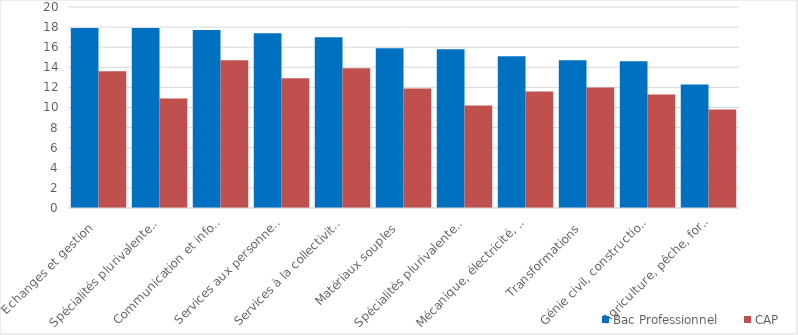
| Category | Bac Professionnel | CAP |
|---|---|---|
| Echanges et gestion | 17.9 | 13.6 |
| Spécialités plurivalentes des services | 17.9 | 10.9 |
| Communication et information | 17.7 | 14.7 |
| Services aux personnes | 17.4 | 12.9 |
| Services à la collectivité | 17 | 13.9 |
| Matériaux souples | 15.9 | 11.9 |
| Spécialités plurivalentes de la production | 15.8 | 10.2 |
| Mécanique, électricité, électronique | 15.1 | 11.6 |
| Transformations | 14.7 | 12 |
| Génie civil, construction, bois | 14.6 | 11.3 |
| Agriculture, pêche, forêt et espaces verts | 12.3 | 9.8 |